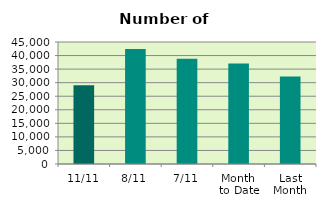
| Category | Series 0 |
|---|---|
| 11/11 | 29084 |
| 8/11 | 42444 |
| 7/11 | 38826 |
| Month 
to Date | 37109.143 |
| Last
Month | 32305.043 |